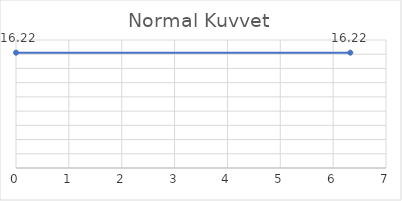
| Category | Series 0 |
|---|---|
| 0.0 | 16.217 |
| 6.324555320336759 | 16.217 |